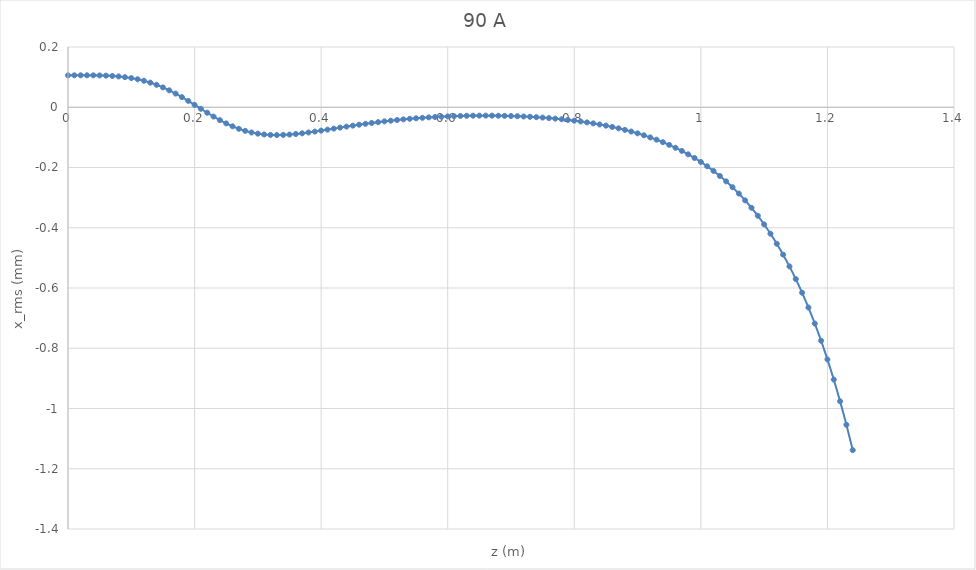
| Category | Series 0 |
|---|---|
| 0.0 | 0.106 |
| 0.01 | 0.106 |
| 0.02 | 0.106 |
| 0.03 | 0.106 |
| 0.04 | 0.106 |
| 0.05 | 0.106 |
| 0.06 | 0.105 |
| 0.07 | 0.104 |
| 0.08 | 0.102 |
| 0.09 | 0.1 |
| 0.1 | 0.097 |
| 0.11 | 0.093 |
| 0.12 | 0.088 |
| 0.13 | 0.082 |
| 0.14 | 0.074 |
| 0.15 | 0.066 |
| 0.16 | 0.056 |
| 0.17 | 0.045 |
| 0.18 | 0.034 |
| 0.19 | 0.021 |
| 0.2 | 0.008 |
| 0.21 | -0.005 |
| 0.22 | -0.018 |
| 0.23 | -0.031 |
| 0.24 | -0.043 |
| 0.25 | -0.054 |
| 0.26 | -0.063 |
| 0.27 | -0.072 |
| 0.28 | -0.078 |
| 0.29 | -0.084 |
| 0.3 | -0.088 |
| 0.31 | -0.09 |
| 0.32 | -0.092 |
| 0.33 | -0.092 |
| 0.34 | -0.092 |
| 0.35 | -0.091 |
| 0.36 | -0.089 |
| 0.37 | -0.086 |
| 0.38 | -0.084 |
| 0.39 | -0.081 |
| 0.4 | -0.078 |
| 0.41 | -0.074 |
| 0.42 | -0.071 |
| 0.43 | -0.068 |
| 0.44 | -0.064 |
| 0.45 | -0.061 |
| 0.46 | -0.058 |
| 0.47 | -0.055 |
| 0.48 | -0.052 |
| 0.49 | -0.049 |
| 0.5 | -0.047 |
| 0.51 | -0.045 |
| 0.52 | -0.042 |
| 0.53 | -0.04 |
| 0.54 | -0.038 |
| 0.55 | -0.037 |
| 0.56 | -0.035 |
| 0.57 | -0.034 |
| 0.58 | -0.032 |
| 0.59 | -0.031 |
| 0.6 | -0.03 |
| 0.61 | -0.03 |
| 0.62 | -0.029 |
| 0.63 | -0.028 |
| 0.64 | -0.028 |
| 0.65 | -0.028 |
| 0.66 | -0.028 |
| 0.67 | -0.028 |
| 0.68 | -0.028 |
| 0.69 | -0.029 |
| 0.7 | -0.029 |
| 0.71 | -0.03 |
| 0.72 | -0.031 |
| 0.73 | -0.032 |
| 0.74 | -0.033 |
| 0.75 | -0.034 |
| 0.76 | -0.036 |
| 0.77 | -0.038 |
| 0.78 | -0.04 |
| 0.79 | -0.042 |
| 0.8 | -0.044 |
| 0.81 | -0.047 |
| 0.82 | -0.05 |
| 0.83 | -0.054 |
| 0.84 | -0.057 |
| 0.85 | -0.061 |
| 0.86 | -0.065 |
| 0.87 | -0.07 |
| 0.88 | -0.075 |
| 0.89 | -0.081 |
| 0.9 | -0.087 |
| 0.91 | -0.093 |
| 0.92 | -0.1 |
| 0.93 | -0.108 |
| 0.94 | -0.116 |
| 0.95 | -0.125 |
| 0.96 | -0.135 |
| 0.97 | -0.145 |
| 0.98 | -0.156 |
| 0.99 | -0.168 |
| 1.0 | -0.182 |
| 1.01 | -0.196 |
| 1.02 | -0.211 |
| 1.03 | -0.228 |
| 1.04 | -0.246 |
| 1.05 | -0.265 |
| 1.06 | -0.286 |
| 1.07 | -0.309 |
| 1.08 | -0.334 |
| 1.09 | -0.36 |
| 1.1 | -0.389 |
| 1.11 | -0.42 |
| 1.12 | -0.453 |
| 1.13 | -0.489 |
| 1.14 | -0.528 |
| 1.15 | -0.57 |
| 1.16 | -0.616 |
| 1.17 | -0.665 |
| 1.18 | -0.718 |
| 1.19 | -0.775 |
| 1.2 | -0.837 |
| 1.21 | -0.904 |
| 1.22 | -0.976 |
| 1.23 | -1.054 |
| 1.24 | -1.138 |